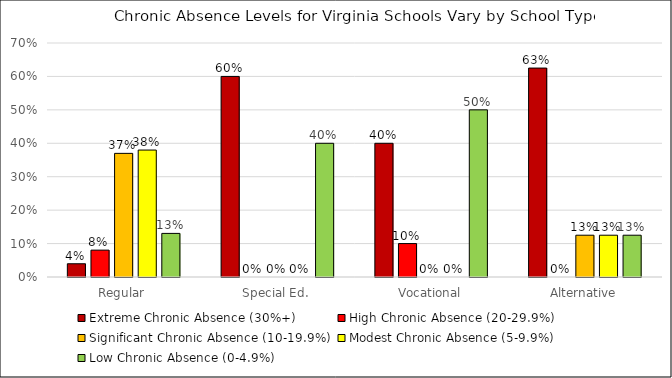
| Category | Extreme Chronic Absence (30%+) | High Chronic Absence (20-29.9%) | Significant Chronic Absence (10-19.9%) | Modest Chronic Absence (5-9.9%) | Low Chronic Absence (0-4.9%) |
|---|---|---|---|---|---|
| Regular | 0.04 | 0.08 | 0.37 | 0.38 | 0.13 |
| Special Ed. | 0.6 | 0 | 0 | 0 | 0.4 |
| Vocational | 0.4 | 0.1 | 0 | 0 | 0.5 |
| Alternative | 0.625 | 0 | 0.125 | 0.125 | 0.125 |